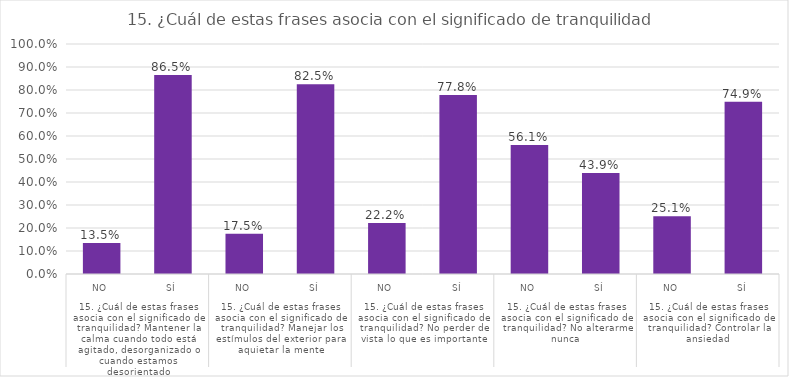
| Category | % del N de columna |
|---|---|
| 0 | 0.135 |
| 1 | 0.865 |
| 2 | 0.175 |
| 3 | 0.825 |
| 4 | 0.222 |
| 5 | 0.778 |
| 6 | 0.561 |
| 7 | 0.439 |
| 8 | 0.251 |
| 9 | 0.749 |